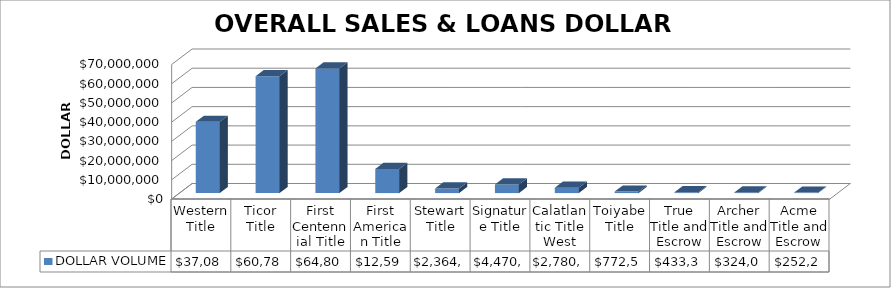
| Category | DOLLAR VOLUME |
|---|---|
| Western Title | 37082459.48 |
| Ticor Title | 60786645 |
| First Centennial Title | 64804438 |
| First American Title | 12596408 |
| Stewart Title | 2364219 |
| Signature Title | 4470500 |
| Calatlantic Title West | 2780492 |
| Toiyabe Title | 772500 |
| True Title and Escrow | 433300 |
| Archer Title and Escrow | 324000 |
| Acme Title and Escrow | 252200 |